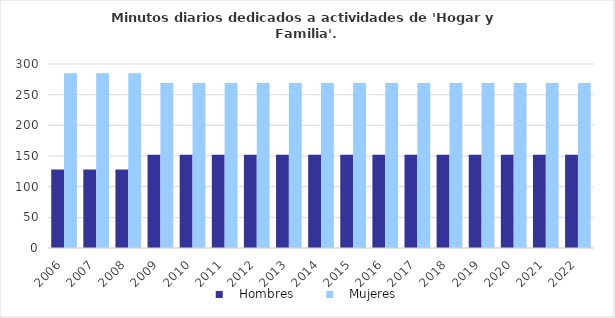
| Category |    Hombres |    Mujeres |
|---|---|---|
| 2006.0 | 128 | 285 |
| 2007.0 | 128 | 285 |
| 2008.0 | 128 | 285 |
| 2009.0 | 152 | 269 |
| 2010.0 | 152 | 269 |
| 2011.0 | 152 | 269 |
| 2012.0 | 152 | 269 |
| 2013.0 | 152 | 269 |
| 2014.0 | 152 | 269 |
| 2015.0 | 152 | 269 |
| 2016.0 | 152 | 269 |
| 2017.0 | 152 | 269 |
| 2018.0 | 152 | 269 |
| 2019.0 | 152 | 269 |
| 2020.0 | 152 | 269 |
| 2021.0 | 152 | 269 |
| 2022.0 | 152 | 269 |